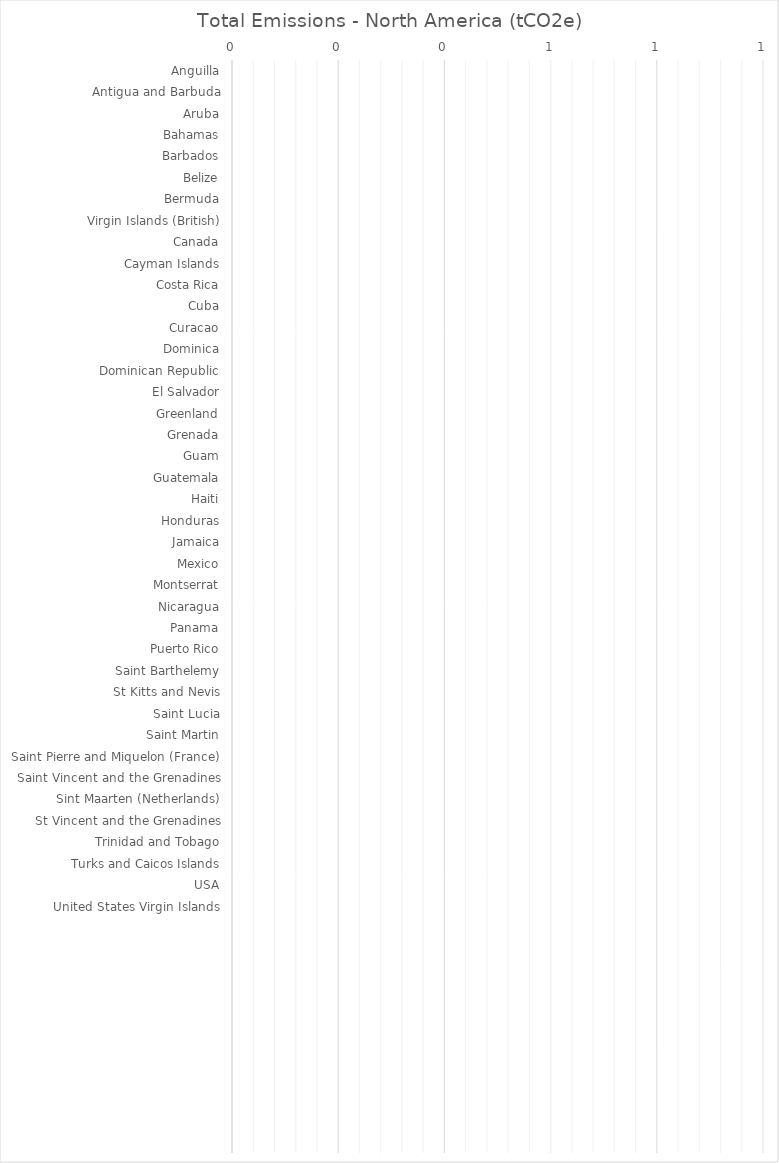
| Category | Total Emissions - North America (tCO2e) |
|---|---|
| Anguilla | 0 |
| Antigua and Barbuda | 0 |
| Aruba | 0 |
| Bahamas | 0 |
| Barbados | 0 |
| Belize | 0 |
| Bermuda | 0 |
| Virgin Islands (British) | 0 |
| Canada | 0 |
| Cayman Islands | 0 |
| Costa Rica | 0 |
| Cuba | 0 |
| Curacao | 0 |
| Dominica | 0 |
| Dominican Republic | 0 |
| El Salvador | 0 |
| Greenland | 0 |
| Grenada | 0 |
| Guam | 0 |
| Guatemala | 0 |
| Haiti | 0 |
| Honduras | 0 |
| Jamaica | 0 |
| Mexico | 0 |
| Montserrat | 0 |
| Nicaragua | 0 |
| Panama | 0 |
| Puerto Rico | 0 |
| Saint Barthelemy | 0 |
| St Kitts and Nevis | 0 |
| Saint Lucia | 0 |
| Saint Martin | 0 |
| Saint Pierre and Miquelon (France) | 0 |
| Saint Vincent and the Grenadines | 0 |
| Sint Maarten (Netherlands) | 0 |
| St Vincent and the Grenadines | 0 |
| Trinidad and Tobago | 0 |
| Turks and Caicos Islands | 0 |
| USA | 0 |
| United States Virgin Islands | 0 |